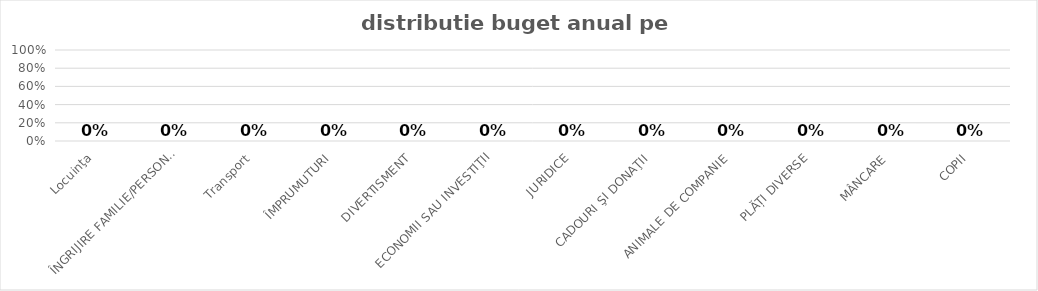
| Category | Series 0 |
|---|---|
| Locuinţa | 0 |
| ÎNGRIJIRE FAMILIE/PERSONALĂ | 0 |
| Transport | 0 |
| ÎMPRUMUTURI | 0 |
| DIVERTISMENT | 0 |
| ECONOMII SAU INVESTIŢII | 0 |
| JURIDICE | 0 |
| CADOURI ŞI DONAŢII | 0 |
| ANIMALE DE COMPANIE | 0 |
| PLĂȚI DIVERSE | 0 |
| MÂNCARE | 0 |
| COPII | 0 |